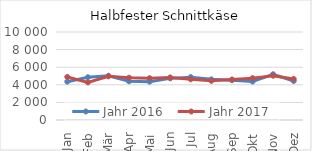
| Category | Jahr 2016 | Jahr 2017 |
|---|---|---|
| Jan | 4356.896 | 4892.639 |
| Feb | 4856.712 | 4272.956 |
| Mär | 5024.307 | 4961.129 |
| Apr | 4398.771 | 4806.42 |
| Mai | 4358.834 | 4748.641 |
| Jun | 4729.937 | 4836.529 |
| Jul | 4871.444 | 4628.18 |
| Aug | 4617.57 | 4456.055 |
| Sep | 4523.717 | 4598.436 |
| Okt | 4367.681 | 4753.571 |
| Nov | 5196.214 | 5035.54 |
| Dez | 4432.815 | 4668.031 |